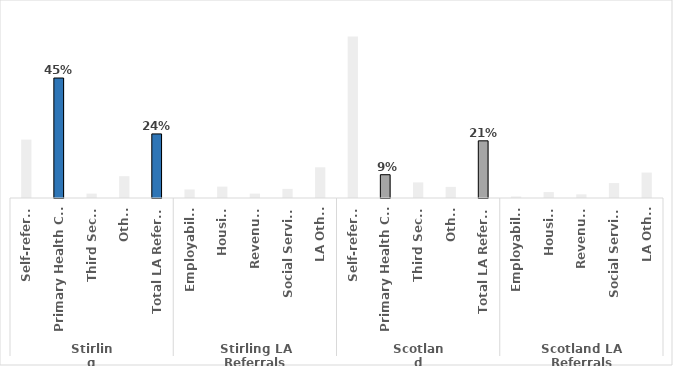
| Category | Series 0 |
|---|---|
| 0 | 0.217 |
| 1 | 0.447 |
| 2 | 0.016 |
| 3 | 0.081 |
| 4 | 0.239 |
| 5 | 0.032 |
| 6 | 0.042 |
| 7 | 0.016 |
| 8 | 0.034 |
| 9 | 0.114 |
| 10 | 0.601 |
| 11 | 0.087 |
| 12 | 0.058 |
| 13 | 0.041 |
| 14 | 0.213 |
| 15 | 0.006 |
| 16 | 0.022 |
| 17 | 0.014 |
| 18 | 0.056 |
| 19 | 0.095 |